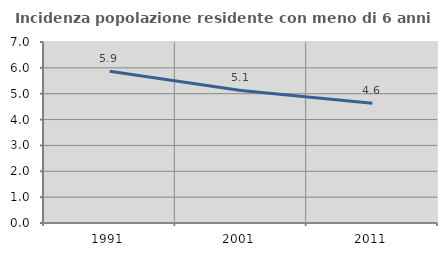
| Category | Incidenza popolazione residente con meno di 6 anni |
|---|---|
| 1991.0 | 5.872 |
| 2001.0 | 5.127 |
| 2011.0 | 4.628 |